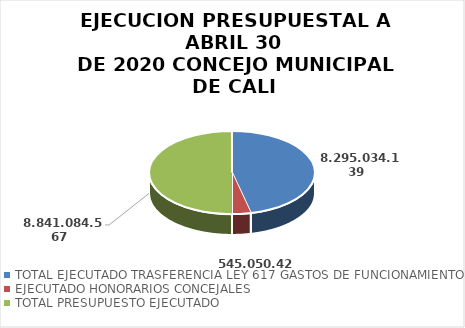
| Category | Series 0 |
|---|---|
| TOTAL EJECUTADO TRASFERENCIA LEY 617 GASTOS DE FUNCIONAMIENTO  | 9077395696 |
| EJECUTADO HONORARIOS CONCEJALES  | 713946728 |
| TOTAL PRESUPUESTO EJECUTADO  | 9791342424 |